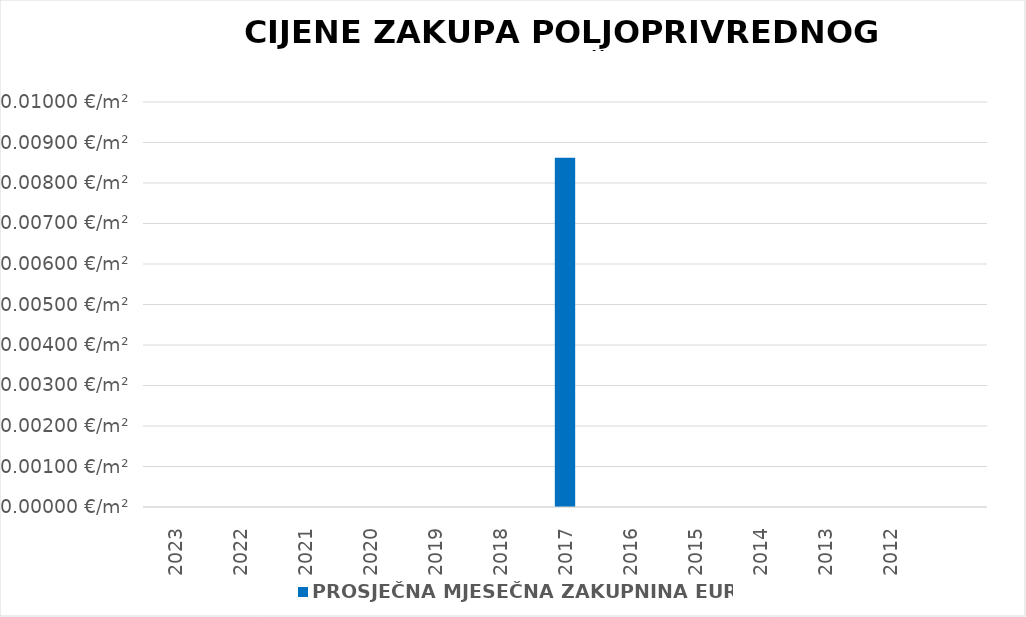
| Category | PROSJEČNA MJESEČNA ZAKUPNINA EUR/m2 |
|---|---|
| 2023 | 0 |
| 2022 | 0 |
| 2021 | 0 |
| 2020 | 0 |
| 2019 | 0 |
| 2018 | 0 |
| 2017 | 0.009 |
| 2016 | 0 |
| 2015 | 0 |
| 2014 | 0 |
| 2013 | 0 |
| 2012 | 0 |